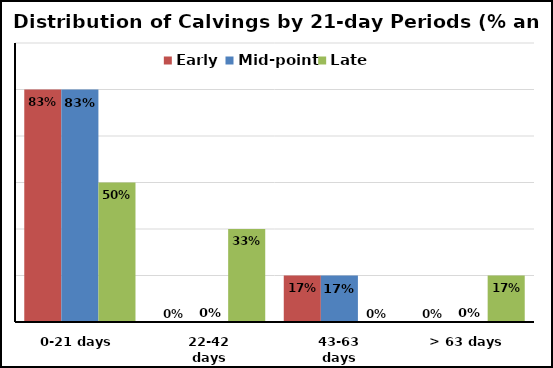
| Category | Early | Mid-point | Late |
|---|---|---|---|
| 0-21 days | 5 | 5 | 3 |
| 22-42 days | 0 | 0 | 2 |
| 43-63 days | 1 | 1 | 0 |
| > 63 days | 0 | 0 | 1 |